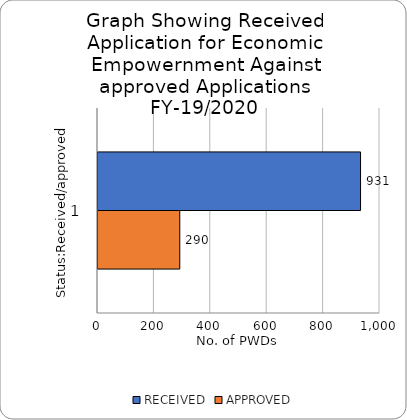
| Category | RECEIVED  | APPROVED |
|---|---|---|
| 0 | 931 | 290 |